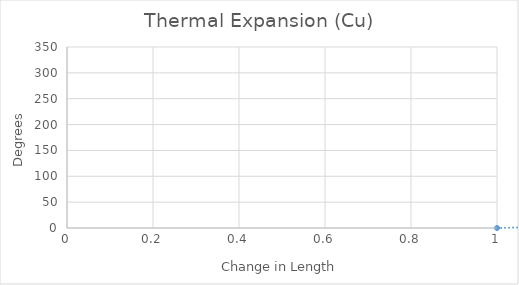
| Category | Series 0 |
|---|---|
| 0 | 0 |
| 1 | 20 |
| 2 | 40 |
| 3 | 60 |
| 4 | 80 |
| 5 | 100 |
| 6 | 120 |
| 7 | 140 |
| 8 | 160 |
| 9 | 180 |
| 10 | 200 |
| 11 | 220 |
| 12 | 240 |
| 13 | 260 |
| 14 | 280 |
| 15 | 300 |